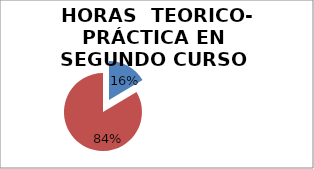
| Category | 168 854 |
|---|---|
| 0 | 168 |
| 1 | 854 |